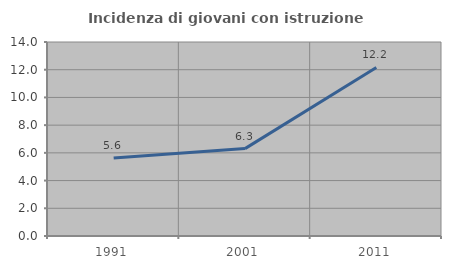
| Category | Incidenza di giovani con istruzione universitaria |
|---|---|
| 1991.0 | 5.634 |
| 2001.0 | 6.306 |
| 2011.0 | 12.162 |